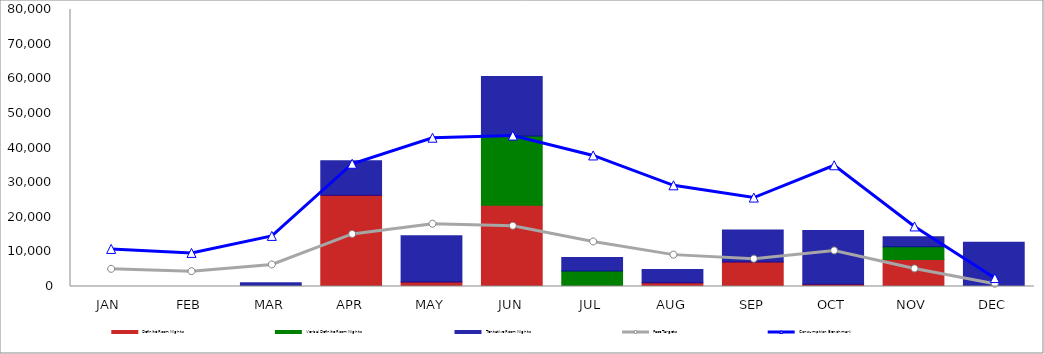
| Category | Definite Room Nights | Verbal Definite Room Nights | Tentative Room Nights |
|---|---|---|---|
| JAN | 0 | 0 | 0 |
| FEB | 0 | 0 | 0 |
| MAR | 0 | 0 | 1105 |
| APR | 26356 | 0 | 9973 |
| MAY | 1308 | 0 | 13337 |
| JUN | 23459 | 19975 | 17243 |
| JUL | 0 | 4474 | 3915 |
| AUG | 1056 | 0 | 3820 |
| SEP | 7055 | 0 | 9282 |
| OCT | 619 | 0 | 15537 |
| NOV | 7826 | 3670 | 2890 |
| DEC | 0 | 0 | 12780 |